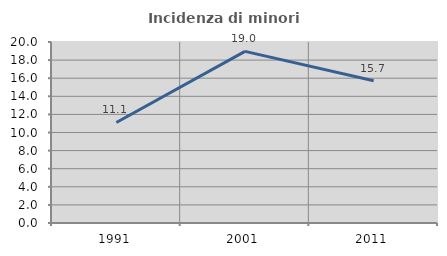
| Category | Incidenza di minori stranieri |
|---|---|
| 1991.0 | 11.111 |
| 2001.0 | 18.966 |
| 2011.0 | 15.726 |